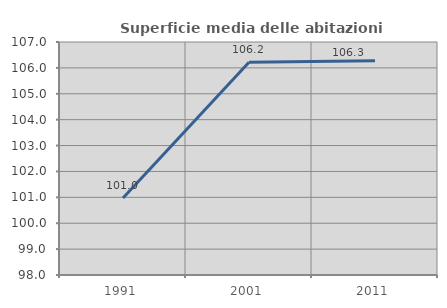
| Category | Superficie media delle abitazioni occupate |
|---|---|
| 1991.0 | 100.975 |
| 2001.0 | 106.217 |
| 2011.0 | 106.276 |